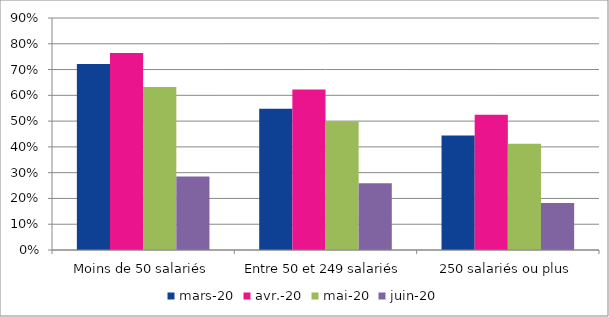
| Category | mars-20 | avr.-20 | mai-20 | juin-20 |
|---|---|---|---|---|
| Moins de 50 salariés | 0.722 | 0.765 | 0.632 | 0.286 |
| Entre 50 et 249 salariés | 0.548 | 0.623 | 0.5 | 0.259 |
| 250 salariés ou plus | 0.445 | 0.525 | 0.412 | 0.182 |